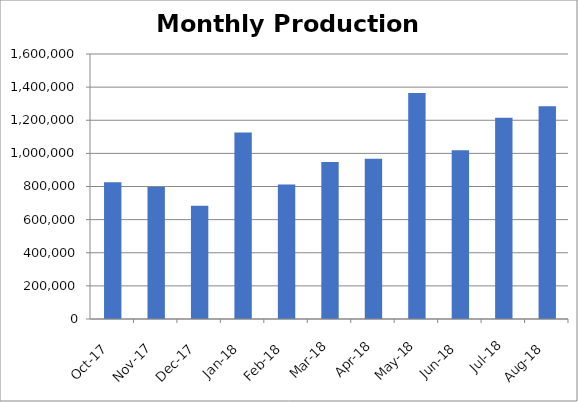
| Category | Series 0 |
|---|---|
| 2017-10-01 | 826096.917 |
| 2017-11-01 | 797045.5 |
| 2017-12-01 | 684479.122 |
| 2018-01-01 | 1125801.25 |
| 2018-02-01 | 812648.5 |
| 2018-03-01 | 947868 |
| 2018-04-01 | 967041 |
| 2018-05-01 | 1364954 |
| 2018-06-01 | 1019579 |
| 2018-07-01 | 1215828 |
| 2018-08-01 | 1284151 |